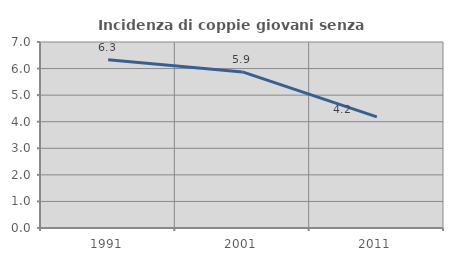
| Category | Incidenza di coppie giovani senza figli |
|---|---|
| 1991.0 | 6.328 |
| 2001.0 | 5.875 |
| 2011.0 | 4.184 |